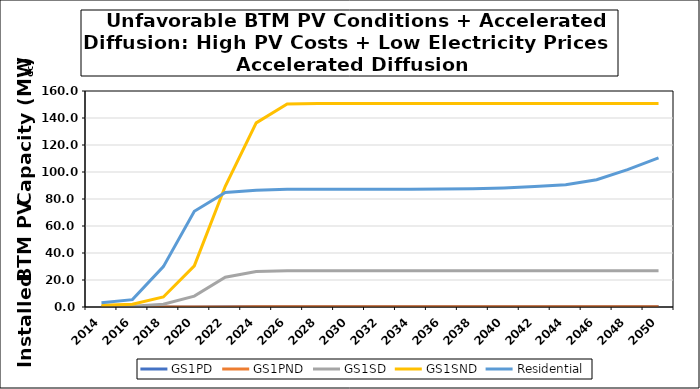
| Category | GS1PD | GS1PND | GS1SD | GS1SND | Residential |
|---|---|---|---|---|---|
| 2014.0 | 0 | 0 | 0.382 | 1.269 | 3.168 |
| 2016.0 | 0 | 0 | 0.597 | 2.097 | 5.467 |
| 2018.0 | 0.01 | 0.004 | 1.997 | 7.418 | 29.906 |
| 2020.0 | 0.056 | 0.023 | 8.054 | 30.481 | 70.919 |
| 2022.0 | 0.213 | 0.091 | 22.024 | 89.454 | 84.808 |
| 2024.0 | 0.379 | 0.184 | 26.29 | 136.356 | 86.483 |
| 2026.0 | 0.423 | 0.223 | 26.855 | 150.457 | 87.163 |
| 2028.0 | 0.424 | 0.223 | 26.857 | 150.761 | 87.268 |
| 2030.0 | 0.424 | 0.223 | 26.857 | 150.761 | 87.284 |
| 2032.0 | 0.424 | 0.223 | 26.857 | 150.761 | 87.292 |
| 2034.0 | 0.424 | 0.223 | 26.857 | 150.761 | 87.308 |
| 2036.0 | 0.424 | 0.223 | 26.857 | 150.761 | 87.342 |
| 2038.0 | 0.424 | 0.223 | 26.857 | 150.761 | 87.558 |
| 2040.0 | 0.424 | 0.223 | 26.857 | 150.761 | 88.148 |
| 2042.0 | 0.424 | 0.223 | 26.857 | 150.761 | 89.229 |
| 2044.0 | 0.424 | 0.223 | 26.857 | 150.761 | 90.605 |
| 2046.0 | 0.424 | 0.223 | 26.857 | 150.761 | 94.322 |
| 2048.0 | 0.424 | 0.223 | 26.857 | 150.761 | 101.789 |
| 2050.0 | 0.424 | 0.223 | 26.857 | 150.761 | 110.409 |